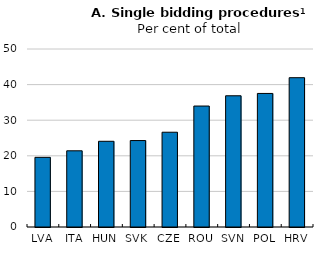
| Category | Series 0 |
|---|---|
| LVA | 19.571 |
| ITA | 21.402 |
| HUN | 24.075 |
| SVK | 24.284 |
| CZE | 26.621 |
| ROU | 33.976 |
| SVN | 36.86 |
| POL | 37.515 |
| HRV | 41.941 |